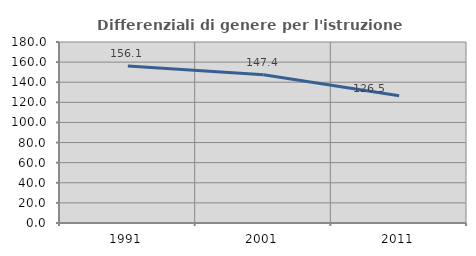
| Category | Differenziali di genere per l'istruzione superiore |
|---|---|
| 1991.0 | 156.115 |
| 2001.0 | 147.362 |
| 2011.0 | 126.451 |